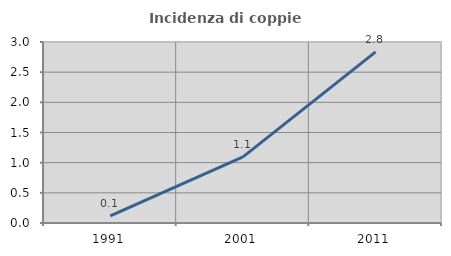
| Category | Incidenza di coppie miste |
|---|---|
| 1991.0 | 0.12 |
| 2001.0 | 1.095 |
| 2011.0 | 2.836 |